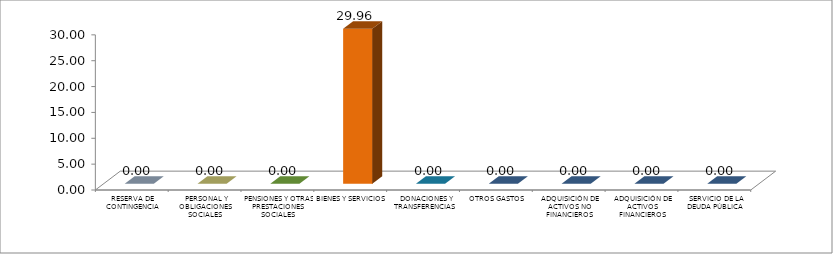
| Category | 1er Trimestre |
|---|---|
|  RESERVA DE CONTINGENCIA | 0 |
|  PERSONAL Y OBLIGACIONES SOCIALES | 0 |
|  PENSIONES Y OTRAS PRESTACIONES SOCIALES | 0 |
|  BIENES Y SERVICIOS | 29.964 |
|   DONACIONES Y TRANSFERENCIAS | 0 |
|  OTROS GASTOS | 0 |
|  ADQUISICIÓN DE ACTIVOS NO FINANCIEROS | 0 |
|  ADQUISICIÓN DE ACTIVOS FINANCIEROS | 0 |
|  SERVICIO DE LA DEUDA PÚBLICA | 0 |